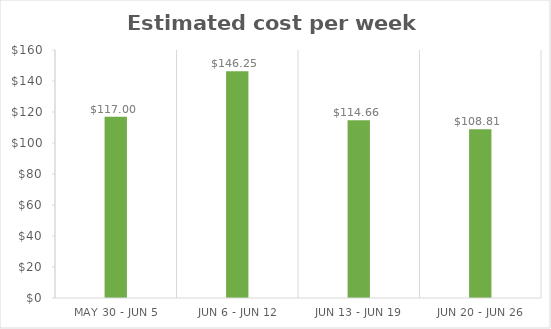
| Category | Estimated cost per week ($)  |
|---|---|
| May 30 - Jun 5 | 117 |
| Jun 6 - Jun 12 | 146.25 |
| Jun 13 - Jun 19 | 114.66 |
| Jun 20 - Jun 26 | 108.81 |